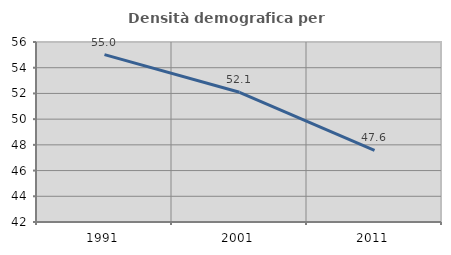
| Category | Densità demografica |
|---|---|
| 1991.0 | 55.019 |
| 2001.0 | 52.089 |
| 2011.0 | 47.578 |